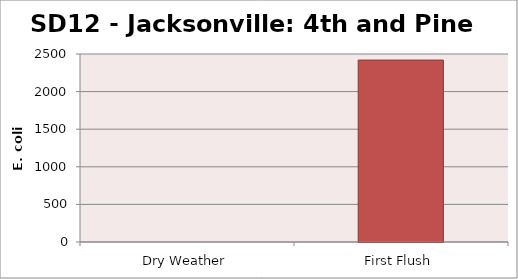
| Category | E. coli MPN |
|---|---|
| Dry Weather | 0 |
| First Flush | 2419.2 |